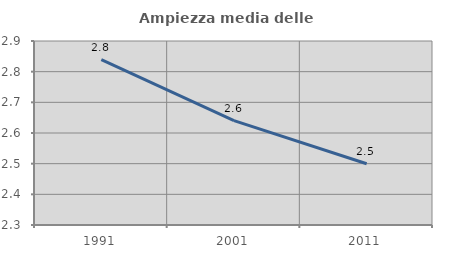
| Category | Ampiezza media delle famiglie |
|---|---|
| 1991.0 | 2.839 |
| 2001.0 | 2.64 |
| 2011.0 | 2.5 |